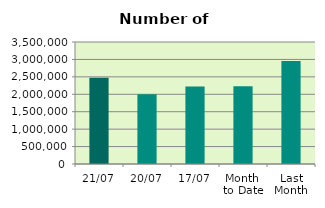
| Category | Series 0 |
|---|---|
| 21/07 | 2473498 |
| 20/07 | 2001790 |
| 17/07 | 2226308 |
| Month 
to Date | 2233992.267 |
| Last
Month | 2956123.091 |